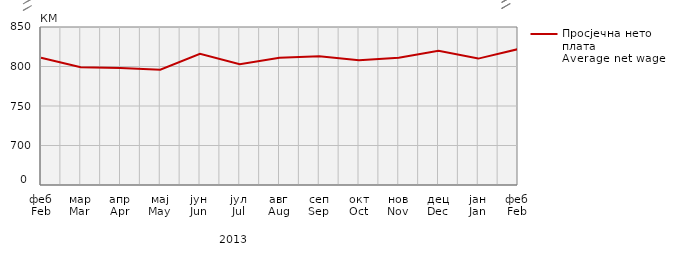
| Category | Просјечна нето плата
Average net wage |
|---|---|
| феб
Feb | 811 |
| мар
Mar | 799 |
| апр
Apr | 798 |
| мај
May | 796 |
| јун
Jun | 816 |
| јул
Jul | 803 |
| авг
Aug | 811 |
| сеп
Sep | 813 |
| окт
Oct | 808 |
| нов
Nov | 811 |
| дец
Dec | 820 |
| јан
Jan | 810 |
| феб
Feb | 822 |